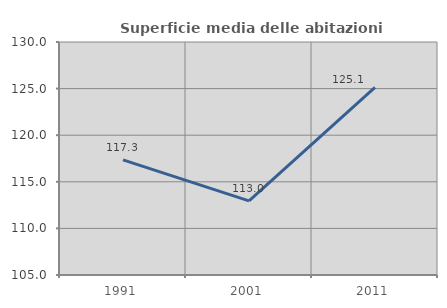
| Category | Superficie media delle abitazioni occupate |
|---|---|
| 1991.0 | 117.346 |
| 2001.0 | 112.951 |
| 2011.0 | 125.128 |